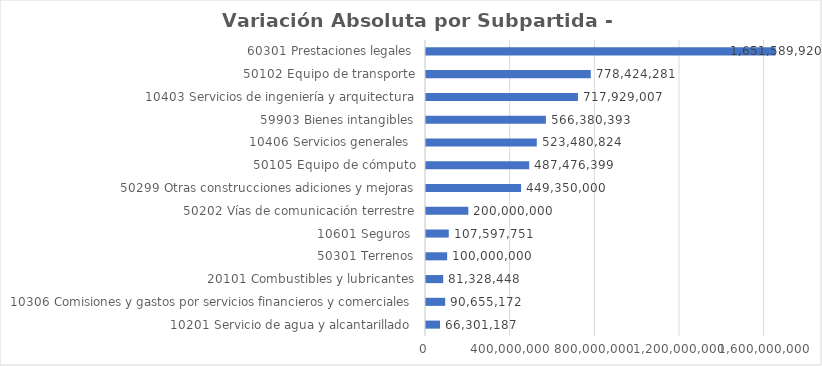
| Category | Variación Absoluta |
|---|---|
| 10201 Servicio de agua y alcantarillado  | 66301187 |
| 10306 Comisiones y gastos por servicios financieros y comerciales | 90655172 |
| 20101 Combustibles y lubricantes | 81328448 |
| 50301 Terrenos | 100000000 |
| 10601 Seguros  | 107597751 |
| 50202 Vías de comunicación terrestre | 200000000 |
| 50299 Otras construcciones adiciones y mejoras | 449350000 |
| 50105 Equipo de cómputo | 487476399 |
| 10406 Servicios generales  | 523480824 |
| 59903 Bienes intangibles | 566380393 |
| 10403 Servicios de ingeniería y arquitectura | 717929007 |
| 50102 Equipo de transporte | 778424281 |
| 60301 Prestaciones legales | 1651589920 |